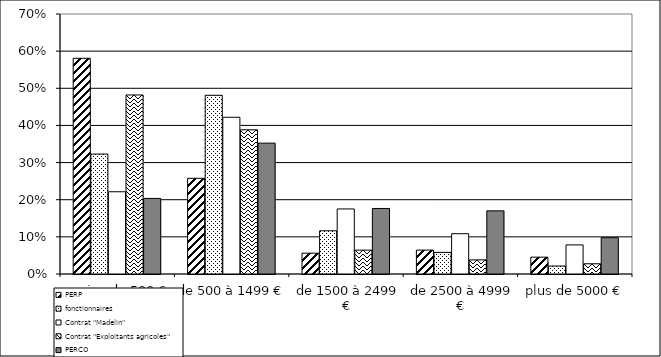
| Category | PERP | fonctionnaires | Contrat "Madelin" | Contrat "Exploitants agricoles" | PERCO |
|---|---|---|---|---|---|
| moins de 500 € | 0.581 | 0.323 | 0.221 | 0.482 | 0.203 |
| de 500 à 1499 € | 0.258 | 0.481 | 0.422 | 0.388 | 0.352 |
| de 1500 à 2499 € | 0.056 | 0.116 | 0.175 | 0.064 | 0.176 |
| de 2500 à 4999 € | 0.064 | 0.058 | 0.108 | 0.038 | 0.17 |
| plus de 5000 € | 0.045 | 0.021 | 0.078 | 0.028 | 0.098 |